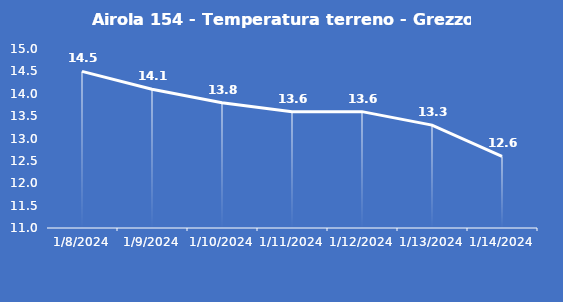
| Category | Airola 154 - Temperatura terreno - Grezzo (°C) |
|---|---|
| 1/8/24 | 14.5 |
| 1/9/24 | 14.1 |
| 1/10/24 | 13.8 |
| 1/11/24 | 13.6 |
| 1/12/24 | 13.6 |
| 1/13/24 | 13.3 |
| 1/14/24 | 12.6 |